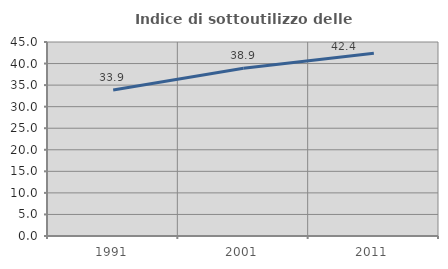
| Category | Indice di sottoutilizzo delle abitazioni  |
|---|---|
| 1991.0 | 33.874 |
| 2001.0 | 38.891 |
| 2011.0 | 42.389 |